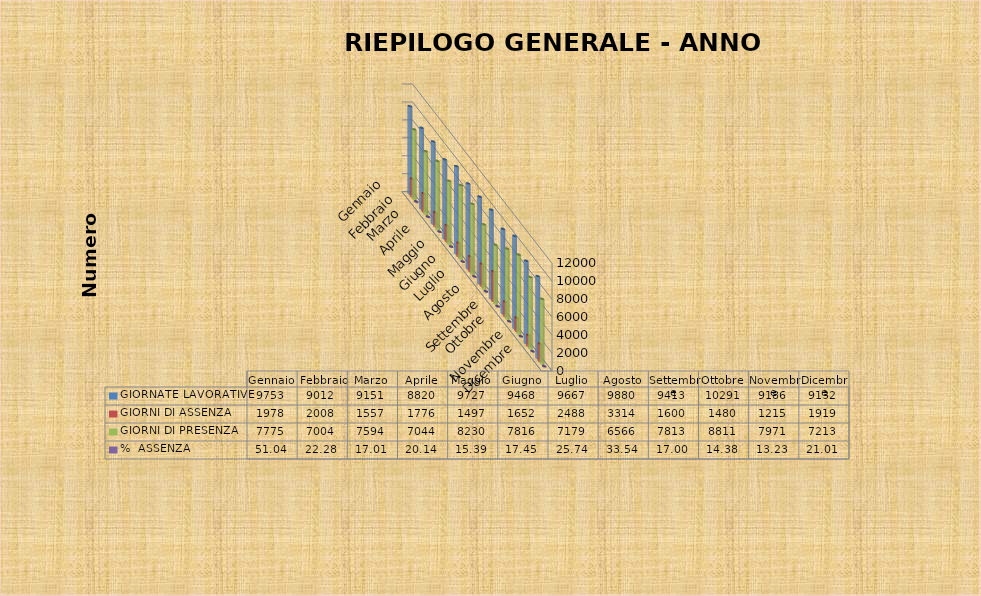
| Category | GIORNATE LAVORATIVE | GIORNI DI ASSENZA | GIORNI DI PRESENZA | %  ASSENZA |
|---|---|---|---|---|
| Gennaio | 9753 | 1978 | 7775 | 51.04 |
| Febbraio | 9012 | 2008 | 7004 | 22.281 |
| Marzo | 9151 | 1557 | 7594 | 17.015 |
| Aprile | 8820 | 1776 | 7044 | 20.136 |
| Maggio | 9727 | 1497 | 8230 | 15.39 |
| Giugno | 9468 | 1652 | 7816 | 17.448 |
| Luglio | 9667 | 2488 | 7179 | 25.737 |
| Agosto | 9880 | 3314 | 6566 | 33.543 |
| Settembre | 9413 | 1600 | 7813 | 16.998 |
| Ottobre | 10291 | 1480 | 8811 | 14.381 |
| Novembre | 9186 | 1215 | 7971 | 13.227 |
| Dicembre | 9132 | 1919 | 7213 | 21.014 |